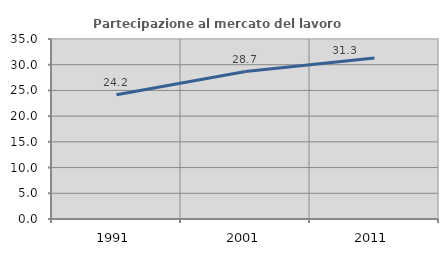
| Category | Partecipazione al mercato del lavoro  femminile |
|---|---|
| 1991.0 | 24.172 |
| 2001.0 | 28.671 |
| 2011.0 | 31.317 |